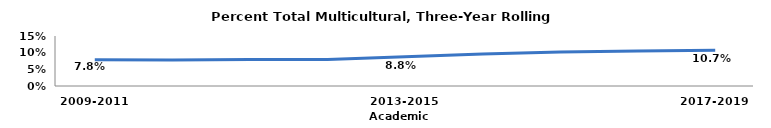
| Category | Series 0 |
|---|---|
| 2009-2011 | 0.078 |
| 2010-2012 | 0.078 |
| 2011-2013 | 0.08 |
| 2012-2014 | 0.079 |
| 2013-2015 | 0.088 |
| 2014-2016 | 0.096 |
| 2015-2017 | 0.102 |
| 2016-2018 | 0.105 |
| 2017-2019 | 0.107 |